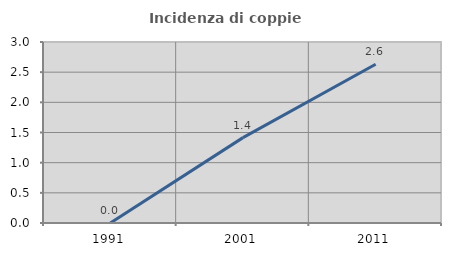
| Category | Incidenza di coppie miste |
|---|---|
| 1991.0 | 0 |
| 2001.0 | 1.415 |
| 2011.0 | 2.632 |